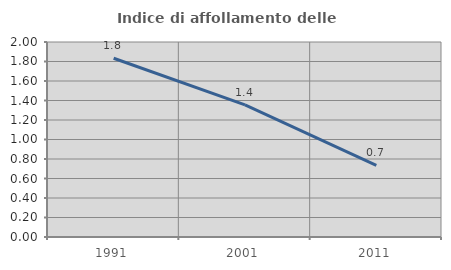
| Category | Indice di affollamento delle abitazioni  |
|---|---|
| 1991.0 | 1.834 |
| 2001.0 | 1.355 |
| 2011.0 | 0.735 |